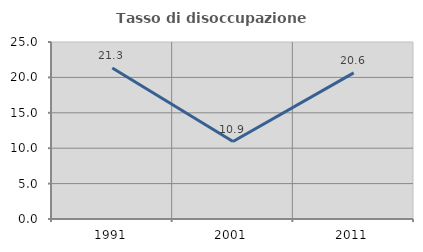
| Category | Tasso di disoccupazione giovanile  |
|---|---|
| 1991.0 | 21.324 |
| 2001.0 | 10.938 |
| 2011.0 | 20.635 |